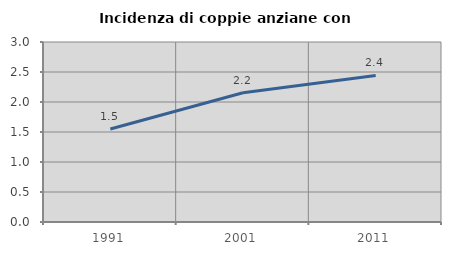
| Category | Incidenza di coppie anziane con figli |
|---|---|
| 1991.0 | 1.55 |
| 2001.0 | 2.153 |
| 2011.0 | 2.442 |